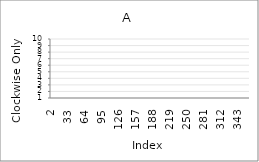
| Category | Series 0 |
|---|---|
| 2.0 | 9 |
| 3.0 | 7 |
| 4.0 | 1 |
| 5.0 | 7 |
| 6.0 | 4 |
| 7.0 | 1 |
| 8.0 | 9 |
| 9.0 | 6 |
| 10.0 | 6 |
| 11.0 | 3 |
| 12.0 | 1 |
| 13.0 | 3 |
| 14.0 | 5 |
| 15.0 | 1 |
| 16.0 | 10 |
| 17.0 | 8 |
| 18.0 | 4 |
| 19.0 | 3 |
| 20.0 | 7 |
| 21.0 | 1 |
| 22.0 | 7 |
| 23.0 | 4 |
| 24.0 | 9 |
| 25.0 | 10 |
| 26.0 | 4 |
| 27.0 | 9 |
| 28.0 | 10 |
| 29.0 | 9 |
| 30.0 | 10 |
| 31.0 | 99 |
| 32.0 | 99 |
| 33.0 | 99 |
| 34.0 | 99 |
| 35.0 | 99 |
| 36.0 | 99 |
| 37.0 | 99 |
| 38.0 | 99 |
| 39.0 | 99 |
| 40.0 | 99 |
| 41.0 | 99 |
| 42.0 | 99 |
| 43.0 | 99 |
| 44.0 | 99 |
| 45.0 | 99 |
| 46.0 | 99 |
| 47.0 | 99 |
| 48.0 | 99 |
| 49.0 | 99 |
| 50.0 | 99 |
| 51.0 | 99 |
| 52.0 | 99 |
| 53.0 | 99 |
| 54.0 | 99 |
| 55.0 | 99 |
| 56.0 | 99 |
| 57.0 | 99 |
| 58.0 | 99 |
| 59.0 | 99 |
| 60.0 | 99 |
| 61.0 | 99 |
| 62.0 | 99 |
| 63.0 | 99 |
| 64.0 | 99 |
| 65.0 | 99 |
| 66.0 | 99 |
| 67.0 | 99 |
| 68.0 | 99 |
| 69.0 | 99 |
| 70.0 | 99 |
| 71.0 | 99 |
| 72.0 | 99 |
| 73.0 | 99 |
| 74.0 | 99 |
| 75.0 | 99 |
| 76.0 | 99 |
| 77.0 | 99 |
| 78.0 | 99 |
| 79.0 | 99 |
| 80.0 | 99 |
| 81.0 | 99 |
| 82.0 | 99 |
| 83.0 | 99 |
| 84.0 | 99 |
| 85.0 | 99 |
| 86.0 | 99 |
| 87.0 | 99 |
| 88.0 | 99 |
| 89.0 | 99 |
| 90.0 | 99 |
| 91.0 | 99 |
| 92.0 | 99 |
| 93.0 | 99 |
| 94.0 | 99 |
| 95.0 | 99 |
| 96.0 | 99 |
| 97.0 | 99 |
| 98.0 | 99 |
| 99.0 | 99 |
| 100.0 | 99 |
| 101.0 | 99 |
| 102.0 | 99 |
| 103.0 | 99 |
| 104.0 | 99 |
| 105.0 | 99 |
| 106.0 | 99 |
| 107.0 | 99 |
| 108.0 | 99 |
| 109.0 | 99 |
| 110.0 | 99 |
| 111.0 | 99 |
| 112.0 | 99 |
| 113.0 | 99 |
| 114.0 | 99 |
| 115.0 | 99 |
| 116.0 | 99 |
| 117.0 | 99 |
| 118.0 | 99 |
| 119.0 | 99 |
| 120.0 | 99 |
| 121.0 | 99 |
| 122.0 | 99 |
| 123.0 | 99 |
| 124.0 | 99 |
| 125.0 | 99 |
| 126.0 | 99 |
| 127.0 | 99 |
| 128.0 | 99 |
| 129.0 | 99 |
| 130.0 | 99 |
| 131.0 | 99 |
| 132.0 | 99 |
| 133.0 | 99 |
| 134.0 | 99 |
| 135.0 | 99 |
| 136.0 | 99 |
| 137.0 | 99 |
| 138.0 | 99 |
| 139.0 | 99 |
| 140.0 | 99 |
| 141.0 | 99 |
| 142.0 | 99 |
| 143.0 | 99 |
| 144.0 | 99 |
| 145.0 | 99 |
| 146.0 | 99 |
| 147.0 | 99 |
| 148.0 | 99 |
| 149.0 | 99 |
| 150.0 | 99 |
| 151.0 | 99 |
| 152.0 | 99 |
| 153.0 | 99 |
| 154.0 | 99 |
| 155.0 | 99 |
| 156.0 | 99 |
| 157.0 | 99 |
| 158.0 | 99 |
| 159.0 | 99 |
| 160.0 | 99 |
| 161.0 | 99 |
| 162.0 | 99 |
| 163.0 | 99 |
| 164.0 | 99 |
| 165.0 | 99 |
| 166.0 | 99 |
| 167.0 | 99 |
| 168.0 | 99 |
| 169.0 | 99 |
| 170.0 | 99 |
| 171.0 | 99 |
| 172.0 | 99 |
| 173.0 | 99 |
| 174.0 | 99 |
| 175.0 | 99 |
| 176.0 | 99 |
| 177.0 | 99 |
| 178.0 | 99 |
| 179.0 | 99 |
| 180.0 | 99 |
| 181.0 | 99 |
| 182.0 | 99 |
| 183.0 | 99 |
| 184.0 | 99 |
| 185.0 | 99 |
| 186.0 | 99 |
| 187.0 | 99 |
| 188.0 | 99 |
| 189.0 | 99 |
| 190.0 | 99 |
| 191.0 | 99 |
| 192.0 | 99 |
| 193.0 | 99 |
| 194.0 | 99 |
| 195.0 | 99 |
| 196.0 | 99 |
| 197.0 | 99 |
| 198.0 | 99 |
| 199.0 | 99 |
| 200.0 | 99 |
| 201.0 | 99 |
| 202.0 | 99 |
| 203.0 | 99 |
| 204.0 | 99 |
| 205.0 | 99 |
| 206.0 | 99 |
| 207.0 | 99 |
| 208.0 | 99 |
| 209.0 | 99 |
| 210.0 | 99 |
| 211.0 | 99 |
| 212.0 | 99 |
| 213.0 | 99 |
| 214.0 | 99 |
| 215.0 | 99 |
| 216.0 | 99 |
| 217.0 | 99 |
| 218.0 | 99 |
| 219.0 | 99 |
| 220.0 | 99 |
| 221.0 | 99 |
| 222.0 | 99 |
| 223.0 | 99 |
| 224.0 | 99 |
| 225.0 | 99 |
| 226.0 | 99 |
| 227.0 | 99 |
| 228.0 | 99 |
| 229.0 | 99 |
| 230.0 | 99 |
| 231.0 | 99 |
| 232.0 | 99 |
| 233.0 | 99 |
| 234.0 | 99 |
| 235.0 | 99 |
| 236.0 | 99 |
| 237.0 | 99 |
| 238.0 | 99 |
| 239.0 | 99 |
| 240.0 | 99 |
| 241.0 | 99 |
| 242.0 | 99 |
| 243.0 | 99 |
| 244.0 | 99 |
| 245.0 | 99 |
| 246.0 | 99 |
| 247.0 | 99 |
| 248.0 | 99 |
| 249.0 | 99 |
| 250.0 | 99 |
| 251.0 | 99 |
| 252.0 | 99 |
| 253.0 | 99 |
| 254.0 | 99 |
| 255.0 | 99 |
| 256.0 | 99 |
| 257.0 | 99 |
| 258.0 | 99 |
| 259.0 | 99 |
| 260.0 | 99 |
| 261.0 | 99 |
| 262.0 | 99 |
| 263.0 | 99 |
| 264.0 | 99 |
| 265.0 | 99 |
| 266.0 | 99 |
| 267.0 | 99 |
| 268.0 | 99 |
| 269.0 | 99 |
| 270.0 | 99 |
| 271.0 | 99 |
| 272.0 | 99 |
| 273.0 | 99 |
| 274.0 | 99 |
| 275.0 | 99 |
| 276.0 | 99 |
| 277.0 | 99 |
| 278.0 | 99 |
| 279.0 | 99 |
| 280.0 | 99 |
| 281.0 | 99 |
| 282.0 | 99 |
| 283.0 | 99 |
| 284.0 | 99 |
| 285.0 | 99 |
| 286.0 | 99 |
| 287.0 | 99 |
| 288.0 | 99 |
| 289.0 | 99 |
| 290.0 | 99 |
| 291.0 | 99 |
| 292.0 | 99 |
| 293.0 | 99 |
| 294.0 | 99 |
| 295.0 | 99 |
| 296.0 | 99 |
| 297.0 | 99 |
| 298.0 | 99 |
| 299.0 | 99 |
| 300.0 | 99 |
| 301.0 | 99 |
| 302.0 | 99 |
| 303.0 | 99 |
| 304.0 | 99 |
| 305.0 | 99 |
| 306.0 | 99 |
| 307.0 | 99 |
| 308.0 | 99 |
| 309.0 | 99 |
| 310.0 | 99 |
| 311.0 | 99 |
| 312.0 | 99 |
| 313.0 | 99 |
| 314.0 | 99 |
| 315.0 | 99 |
| 316.0 | 99 |
| 317.0 | 99 |
| 318.0 | 99 |
| 319.0 | 99 |
| 320.0 | 99 |
| 321.0 | 99 |
| 322.0 | 99 |
| 323.0 | 99 |
| 324.0 | 99 |
| 325.0 | 99 |
| 326.0 | 99 |
| 327.0 | 99 |
| 328.0 | 99 |
| 329.0 | 99 |
| 330.0 | 99 |
| 331.0 | 99 |
| 332.0 | 99 |
| 333.0 | 99 |
| 334.0 | 99 |
| 335.0 | 99 |
| 336.0 | 99 |
| 337.0 | 99 |
| 338.0 | 99 |
| 339.0 | 99 |
| 340.0 | 99 |
| 341.0 | 99 |
| 342.0 | 99 |
| 343.0 | 99 |
| 344.0 | 99 |
| 345.0 | 99 |
| 346.0 | 99 |
| 347.0 | 99 |
| 348.0 | 99 |
| 349.0 | 99 |
| 350.0 | 99 |
| 351.0 | 99 |
| 352.0 | 99 |
| 353.0 | 99 |
| 354.0 | 99 |
| 355.0 | 99 |
| 356.0 | 99 |
| 357.0 | 99 |
| 358.0 | 99 |
| 359.0 | 99 |
| 360.0 | 99 |
| 361.0 | 99 |
| 362.0 | 99 |
| 363.0 | 99 |
| 364.0 | 99 |
| 365.0 | 99 |